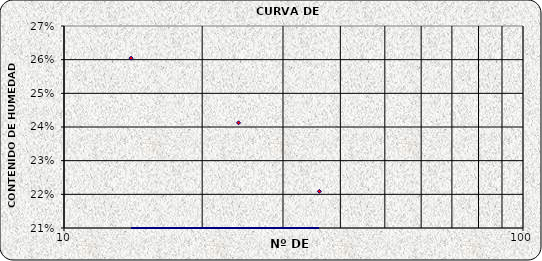
| Category | Series 0 |
|---|---|
| 36.0 | 0.221 |
| 24.0 | 0.241 |
| 14.0 | 0.26 |